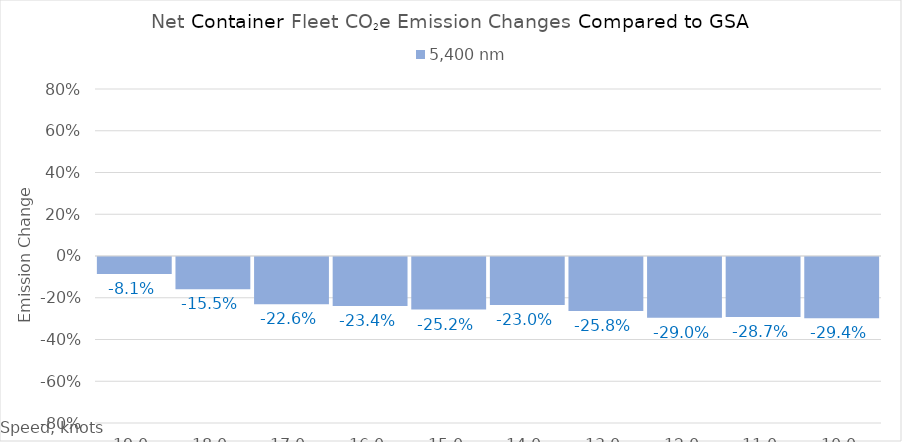
| Category | 5,400 |
|---|---|
| 19.0 | -0.081 |
| 18.0 | -0.155 |
| 17.0 | -0.226 |
| 16.0 | -0.234 |
| 15.0 | -0.252 |
| 14.0 | -0.23 |
| 13.0 | -0.258 |
| 12.0 | -0.29 |
| 11.0 | -0.287 |
| 10.0 | -0.294 |